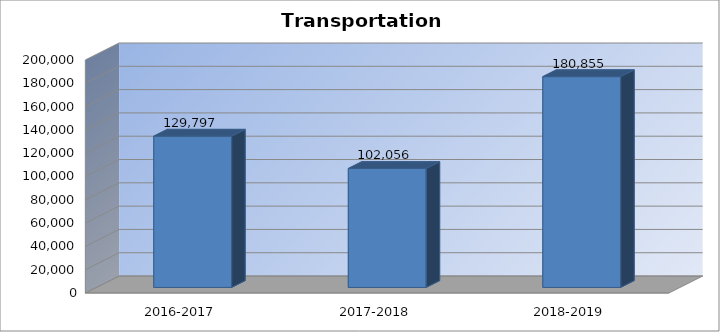
| Category | Transportation Expenditures |
|---|---|
| 2016-2017 | 129797 |
| 2017-2018 | 102056 |
| 2018-2019 | 180855 |